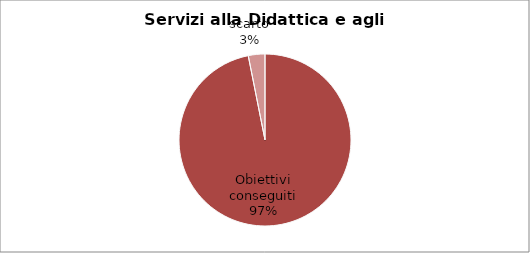
| Category | Series 0 |
|---|---|
| Obiettivi conseguiti | 96.875 |
| scarto | 3.125 |